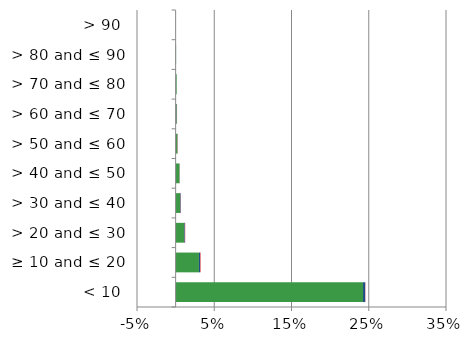
| Category | England | Scotland | Wales |
|---|---|---|---|
| < 10 | 0.243 | 0.003 | 0 |
| ≥ 10 and ≤ 20 | 0.03 | 0.002 | 0.001 |
| > 20 and ≤ 30 | 0.011 | 0.001 | 0 |
| > 30 and ≤ 40 | 0.006 | 0.001 | 0 |
| > 40 and ≤ 50 | 0.005 | 0 | 0 |
| > 50 and ≤ 60 | 0.002 | 0 | 0 |
| > 60 and ≤ 70 | 0.001 | 0 | 0 |
| > 70 and ≤ 80 | 0.001 | 0 | 0 |
| > 80 and ≤ 90 | 0.001 | 0 | 0 |
| > 90 | 0 | 0 | 0 |